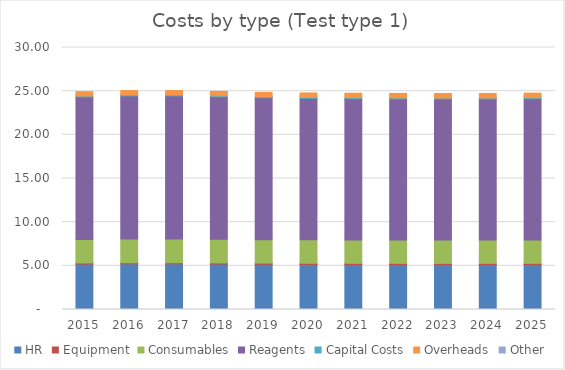
| Category | HR | Equipment | Consumables | Reagents | Capital Costs | Overheads | Other |
|---|---|---|---|---|---|---|---|
| 2015.0 | 5.195 | 0.136 | 2.697 | 16.312 | 0.106 | 0.498 | 0 |
| 2016.0 | 5.22 | 0.137 | 2.71 | 16.391 | 0.106 | 0.5 | 0 |
| 2017.0 | 5.22 | 0.137 | 2.71 | 16.393 | 0.107 | 0.503 | 0 |
| 2018.0 | 5.199 | 0.137 | 2.7 | 16.327 | 0.107 | 0.505 | 0 |
| 2019.0 | 5.175 | 0.136 | 2.687 | 16.252 | 0.108 | 0.508 | 0 |
| 2020.0 | 5.159 | 0.135 | 2.679 | 16.201 | 0.108 | 0.51 | 0 |
| 2021.0 | 5.153 | 0.135 | 2.675 | 16.181 | 0.109 | 0.513 | 0 |
| 2022.0 | 5.148 | 0.135 | 2.673 | 16.165 | 0.11 | 0.515 | 0 |
| 2023.0 | 5.144 | 0.135 | 2.671 | 16.154 | 0.11 | 0.518 | 0 |
| 2024.0 | 5.145 | 0.135 | 2.672 | 16.157 | 0.111 | 0.52 | 0 |
| 2025.0 | 5.152 | 0.135 | 2.675 | 16.177 | 0.111 | 0.523 | 0 |